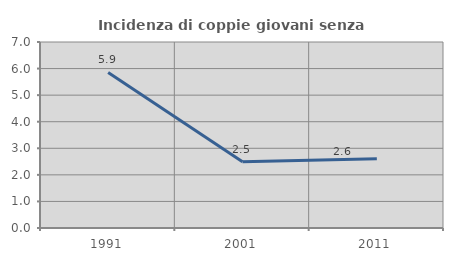
| Category | Incidenza di coppie giovani senza figli |
|---|---|
| 1991.0 | 5.856 |
| 2001.0 | 2.49 |
| 2011.0 | 2.609 |